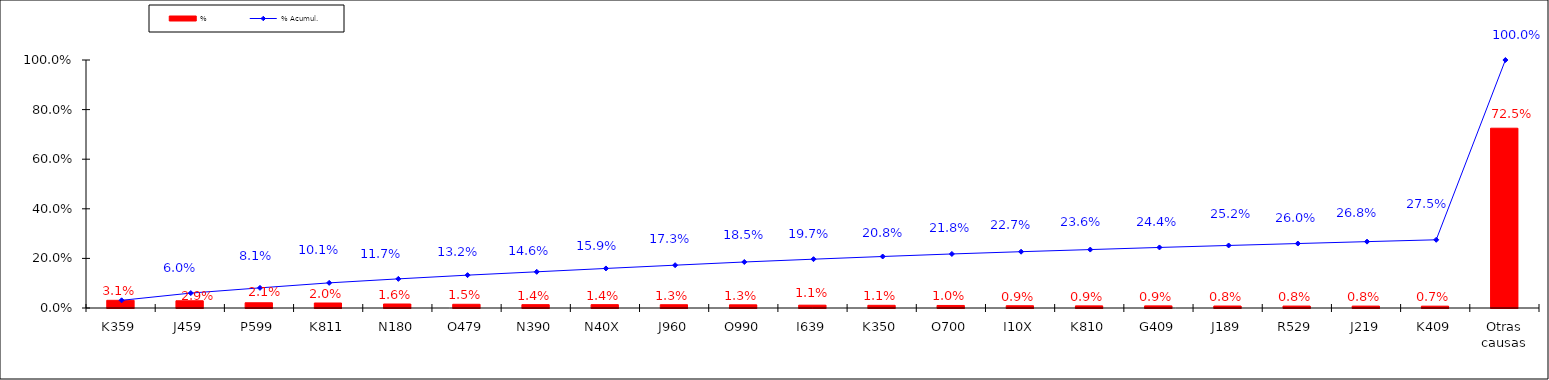
| Category | % |
|---|---|
| K359 | 0.031 |
| J459 | 0.029 |
| P599 | 0.021 |
| K811 | 0.02 |
| N180 | 0.016 |
| O479 | 0.015 |
| N390 | 0.014 |
| N40X | 0.014 |
| J960 | 0.013 |
| O990 | 0.013 |
| I639 | 0.011 |
| K350 | 0.011 |
| O700 | 0.01 |
| I10X | 0.009 |
| K810 | 0.009 |
| G409 | 0.009 |
| J189 | 0.008 |
| R529 | 0.008 |
| J219 | 0.008 |
| K409 | 0.007 |
| Otras causas | 0.725 |